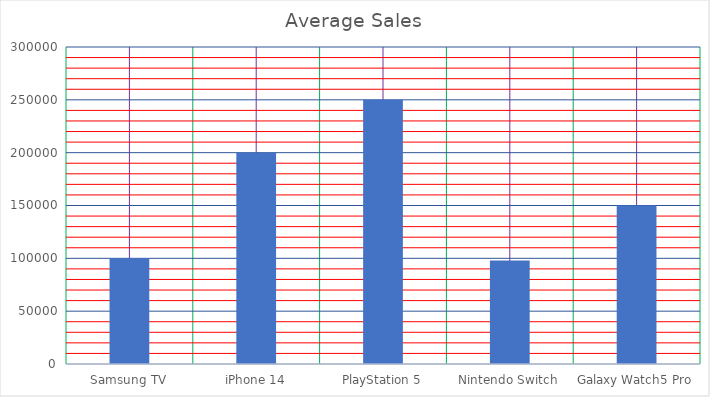
| Category | Average Sales |
|---|---|
| Samsung TV | 100000 |
| iPhone 14 | 200000 |
| PlayStation 5 | 250000 |
| Nintendo Switch | 98000 |
| Galaxy Watch5 Pro | 150000 |